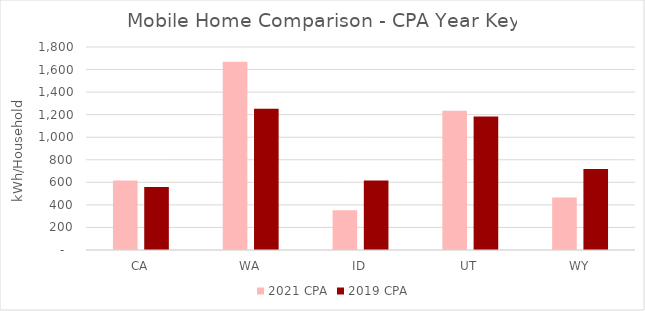
| Category | 2021 CPA | 2019 CPA |
|---|---|---|
|  CA  | 616.605 | 558.029 |
|  WA  | 1669.291 | 1253.485 |
|  ID  | 352.918 | 616.146 |
|  UT  | 1234.213 | 1184.577 |
|  WY  | 465.355 | 718.907 |